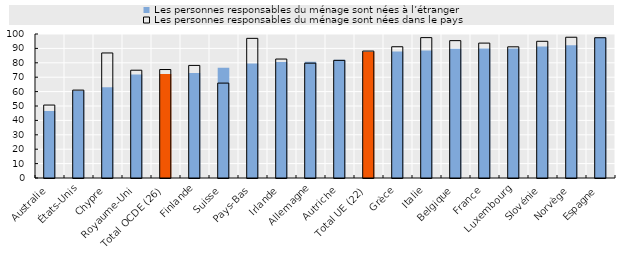
| Category | Les personnes responsables du ménage sont nées à l’étranger | Les personnes responsables du ménage sont nées dans le pays |
|---|---|---|
| Australie | 46.521 | 50.652 |
| États-Unis | 60.58 | 61.04 |
| Chypre | 62.994 | 86.828 |
| Royaume-Uni | 71.894 | 74.851 |
| Total OCDE (26) | 72.243 | 75.328 |
| Finlande | 72.841 | 78.184 |
| Suisse | 76.561 | 65.906 |
| Pays-Bas | 79.439 | 96.974 |
| Irlande | 80.532 | 82.606 |
| Allemagne | 80.78 | 79.743 |
| Autriche | 82.078 | 81.702 |
| Total UE (22) | 87.605 | 88.158 |
| Grèce | 87.85 | 91.149 |
| Italie | 88.605 | 97.483 |
| Belgique | 89.806 | 95.394 |
| France | 89.942 | 93.676 |
| Luxembourg | 89.97 | 91.1 |
| Slovénie | 91.238 | 94.936 |
| Norvège | 92.25 | 97.75 |
| Espagne | 97.698 | 97.401 |